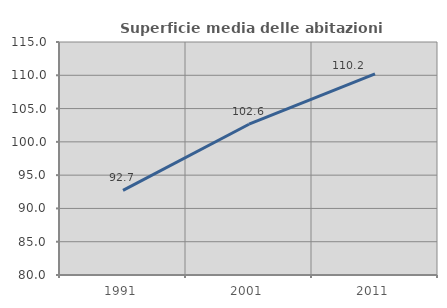
| Category | Superficie media delle abitazioni occupate |
|---|---|
| 1991.0 | 92.719 |
| 2001.0 | 102.648 |
| 2011.0 | 110.216 |